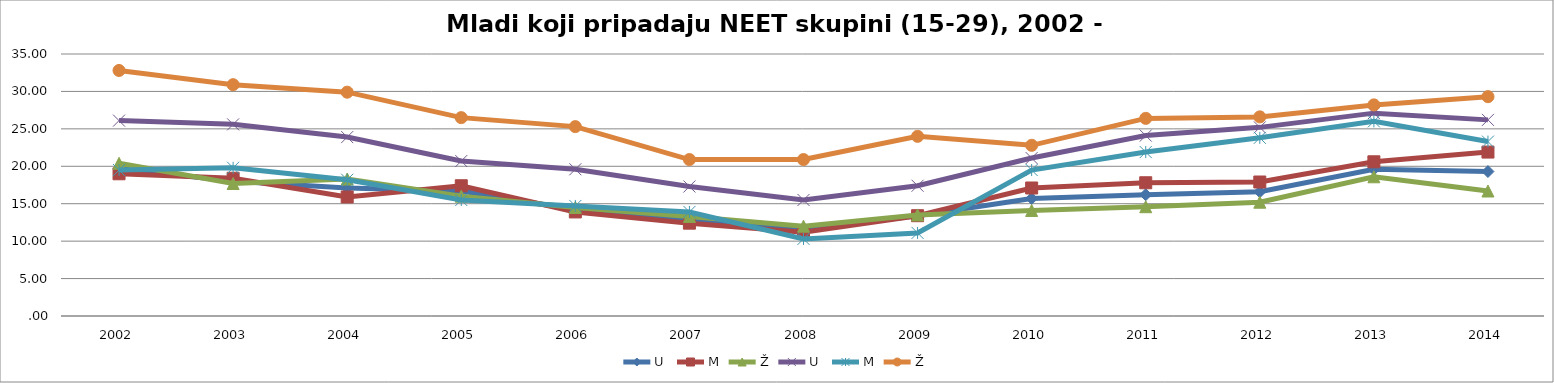
| Category | U  | M | Ž |
|---|---|---|---|
| 2002 | 26.1 | 19.5 | 32.8 |
| 2003 | 25.6 | 19.8 | 30.9 |
| 2004 | 23.9 | 18.2 | 29.9 |
| 2005 | 20.7 | 15.5 | 26.5 |
| 2006 | 19.6 | 14.7 | 25.3 |
| 2007 | 17.3 | 13.9 | 20.9 |
| 2008 | 15.5 | 10.3 | 20.9 |
| 2009 | 17.4 | 11.1 | 24 |
| 2010 | 21.1 | 19.5 | 22.8 |
| 2011 | 24.1 | 21.9 | 26.4 |
| 2012 | 25.2 | 23.8 | 26.6 |
| 2013 | 27.1 | 26 | 28.2 |
| 2014 | 26.2 | 23.3 | 29.3 |